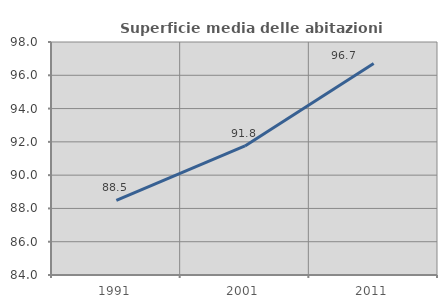
| Category | Superficie media delle abitazioni occupate |
|---|---|
| 1991.0 | 88.481 |
| 2001.0 | 91.757 |
| 2011.0 | 96.706 |